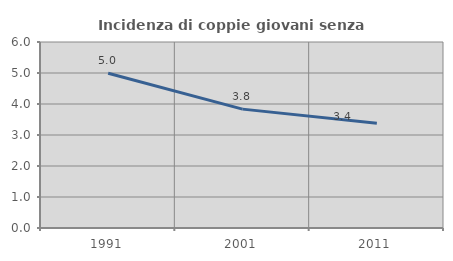
| Category | Incidenza di coppie giovani senza figli |
|---|---|
| 1991.0 | 4.992 |
| 2001.0 | 3.835 |
| 2011.0 | 3.381 |